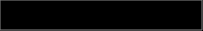
| Category | Series 0 |
|---|---|
| 0 | 0.107 |
| 1 | 0.857 |
| 2 | 0.037 |